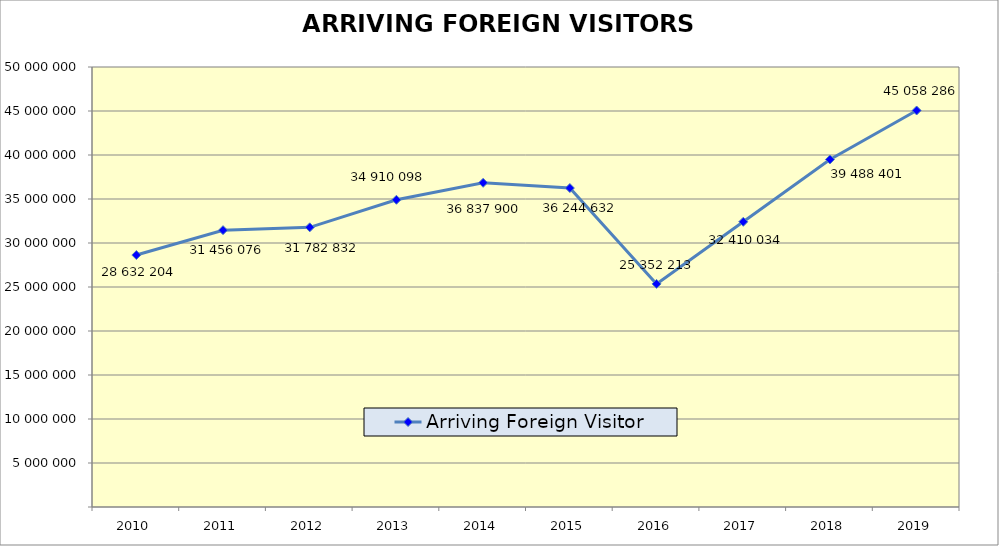
| Category | Arriving Foreign Visitor |
|---|---|
| 2010.0 | 28632204 |
| 2011.0 | 31456076 |
| 2012.0 | 31782832 |
| 2013.0 | 34910098 |
| 2014.0 | 36837900 |
| 2015.0 | 36244632 |
| 2016.0 | 25352213 |
| 2017.0 | 32410034 |
| 2018.0 | 39488401 |
| 2019.0 | 45058286 |